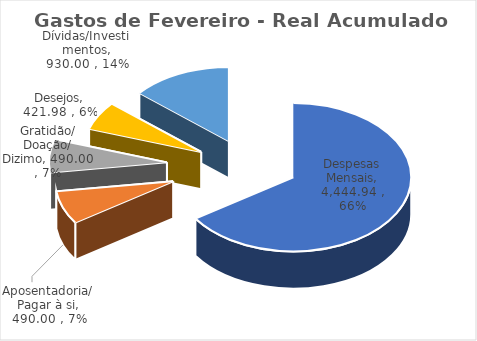
| Category | Gastos de Fevereiro - Real Acumulado |
|---|---|
| Despesas Mensais | 4444.94 |
| Aposentadoria/Pagar à si | 490 |
| Gratidão/ Doação/ Dizimo | 490 |
| Desejos | 421.98 |
| Dívidas/Investimentos | 930 |